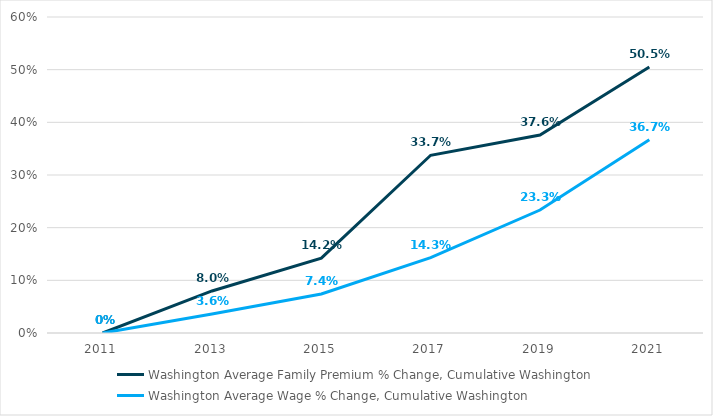
| Category | Washington |
|---|---|
| 2011.0 | 0 |
| 2013.0 | 0.036 |
| 2015.0 | 0.074 |
| 2017.0 | 0.143 |
| 2019.0 | 0.233 |
| 2021.0 | 0.367 |